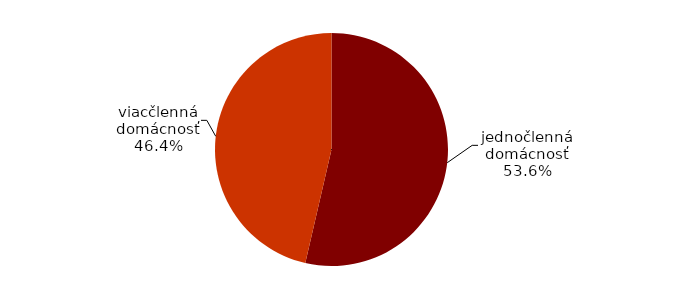
| Category | Series 0 |
|---|---|
| jednočlenná domácnosť | 0.536 |
| viacčlenná domácnosť | 0.464 |